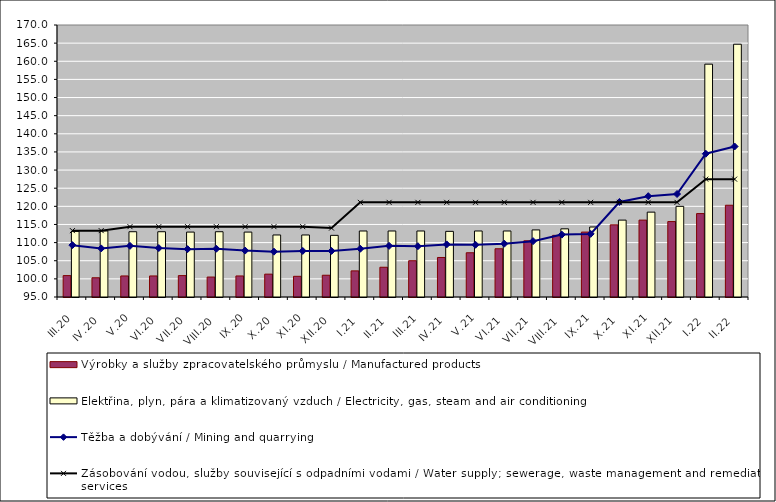
| Category | Výrobky a služby zpracovatelského průmyslu / Manufactured products | Elektřina, plyn, pára a klimatizovaný vzduch / Electricity, gas, steam and air conditioning |
|---|---|---|
| III.20 | 100.9 | 113.1 |
| IV.20 | 100.3 | 113.2 |
| V.20 | 100.8 | 113 |
| VI.20 | 100.8 | 113 |
| VII.20 | 100.9 | 112.9 |
| VIII.20 | 100.5 | 113 |
| IX.20 | 100.8 | 112.9 |
| X.20 | 101.3 | 112.1 |
| XI.20 | 100.7 | 112.1 |
| XII.20 | 101 | 112 |
| I.21 | 102.2 | 113.2 |
| II.21 | 103.2 | 113.2 |
| III.21 | 105 | 113.2 |
| IV.21 | 105.9 | 113.1 |
| V.21 | 107.2 | 113.2 |
| VI.21 | 108.3 | 113.2 |
| VII.21 | 110.5 | 113.5 |
| VIII.21 | 112 | 113.8 |
| IX.21 | 112.9 | 114.3 |
| X.21 | 114.9 | 116.2 |
| XI.21 | 116.2 | 118.4 |
| XII.21 | 115.8 | 120 |
| I.22 | 118 | 159.2 |
| II.22 | 120.3 | 164.7 |